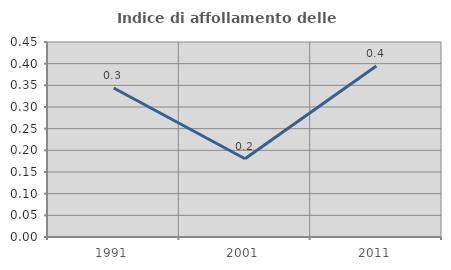
| Category | Indice di affollamento delle abitazioni  |
|---|---|
| 1991.0 | 0.344 |
| 2001.0 | 0.18 |
| 2011.0 | 0.395 |